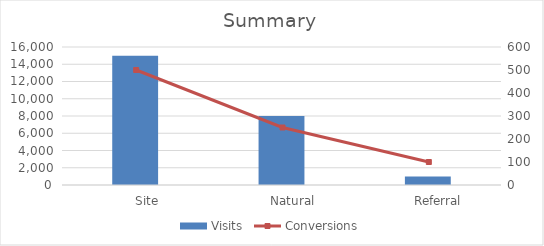
| Category | Visits |
|---|---|
|       Site | 15000 |
|       Natural | 8000 |
|       Referral | 1000 |